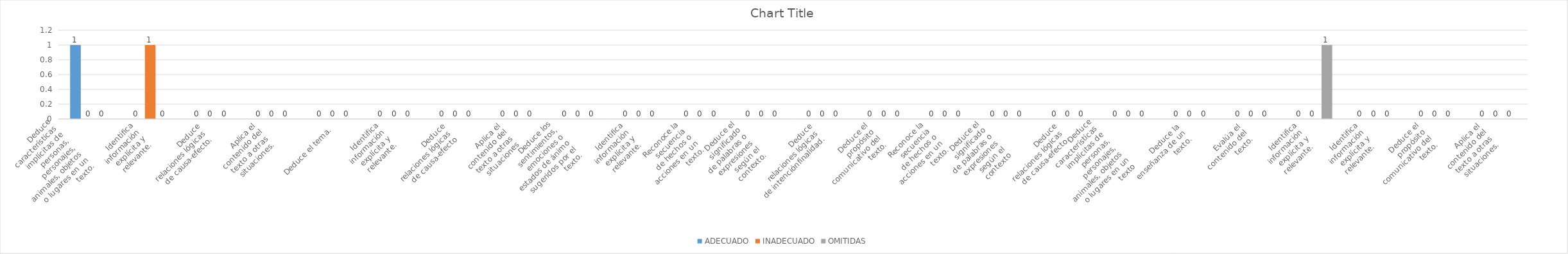
| Category | ADECUADO | INADECUADO | OMITIDAS |
|---|---|---|---|
| Deduce
características
implícitas de
personas,
personajes,
animales, objetos
o lugares en un
texto. | 1 | 0 | 0 |
| Identifica
información
explícita y
relevante. | 0 | 1 | 0 |
| Deduce
relaciones lógicas
de causa-efecto. | 0 | 0 | 0 |
| Aplica el
contenido del
texto a otras
situaciones. | 0 | 0 | 0 |
| Deduce el tema. | 0 | 0 | 0 |
| Identifica
información
explícita y
relevante. | 0 | 0 | 0 |
| Deduce
relaciones lógicas
de causa-efecto | 0 | 0 | 0 |
| Aplica el
contenido del
texto a otras
situaciones | 0 | 0 | 0 |
| Deduce los
sentimientos,
emociones o
estados de ánimo
sugeridos por el
texto. | 0 | 0 | 0 |
| Identifica
información
explícita y
relevante. | 0 | 0 | 0 |
| Reconoce la
secuencia
de hechos o
acciones en un
texto. | 0 | 0 | 0 |
| Deduce el
significado
de palabras o
expresiones
según el
contexto. | 0 | 0 | 0 |
| Deduce
relaciones lógicas
de intenciónfinalidad. | 0 | 0 | 0 |
| Deduce el
propósito
comunicativo del
texto. | 0 | 0 | 0 |
| Reconoce la
secuencia
de hechos o
acciones en un
texto. | 0 | 0 | 0 |
| Deduce el
significado
de palabras o
expresiones
según el
contexto | 0 | 0 | 0 |
| Deduce
relaciones lógicas
de causa-efecto. | 0 | 0 | 0 |
| Deduce
características
implícitas de
personas,
personajes,
animales, objetos
o lugares en un
texto | 0 | 0 | 0 |
| Deduce la
enseñanza de un
texto. | 0 | 0 | 0 |
| Evalúa el
contenido del
texto. | 0 | 0 | 0 |
| Identifica
información
explícita y
relevante.  | 0 | 0 | 1 |
| Identifica
información
explícita y
relevante.  | 0 | 0 | 0 |
| Deduce el
propósito
comunicativo del
texto. | 0 | 0 | 0 |
| Aplica el
contenido del
texto a otras
situaciones. | 0 | 0 | 0 |